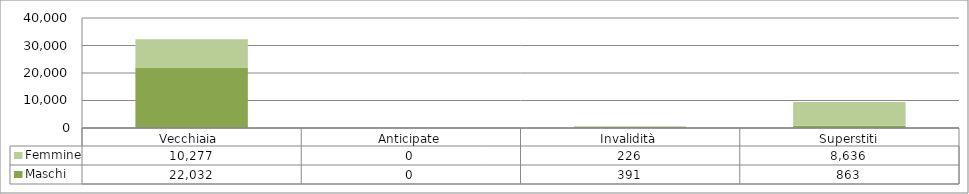
| Category | Maschi | Femmine |
|---|---|---|
| Vecchiaia  | 22032 | 10277 |
| Anticipate | 0 | 0 |
| Invalidità | 391 | 226 |
| Superstiti | 863 | 8636 |